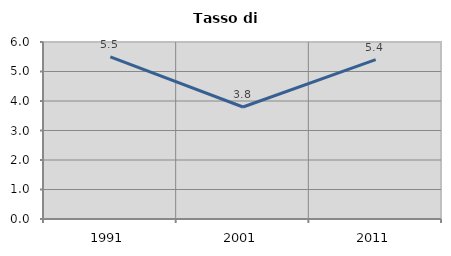
| Category | Tasso di disoccupazione   |
|---|---|
| 1991.0 | 5.496 |
| 2001.0 | 3.796 |
| 2011.0 | 5.401 |